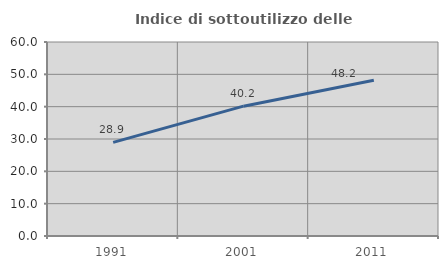
| Category | Indice di sottoutilizzo delle abitazioni  |
|---|---|
| 1991.0 | 28.947 |
| 2001.0 | 40.152 |
| 2011.0 | 48.157 |